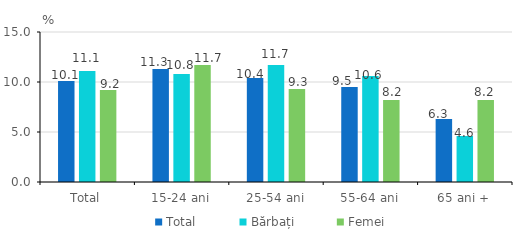
| Category | Total | Bărbați | Femei |
|---|---|---|---|
| Total | 10.1 | 11.1 | 9.2 |
| 15-24 ani | 11.3 | 10.8 | 11.7 |
| 25-54 ani | 10.4 | 11.7 | 9.3 |
| 55-64 ani | 9.5 | 10.6 | 8.2 |
| 65 ani + | 6.3 | 4.6 | 8.2 |